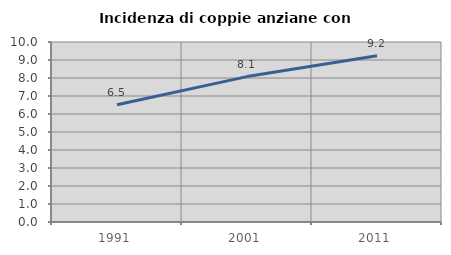
| Category | Incidenza di coppie anziane con figli |
|---|---|
| 1991.0 | 6.516 |
| 2001.0 | 8.078 |
| 2011.0 | 9.236 |